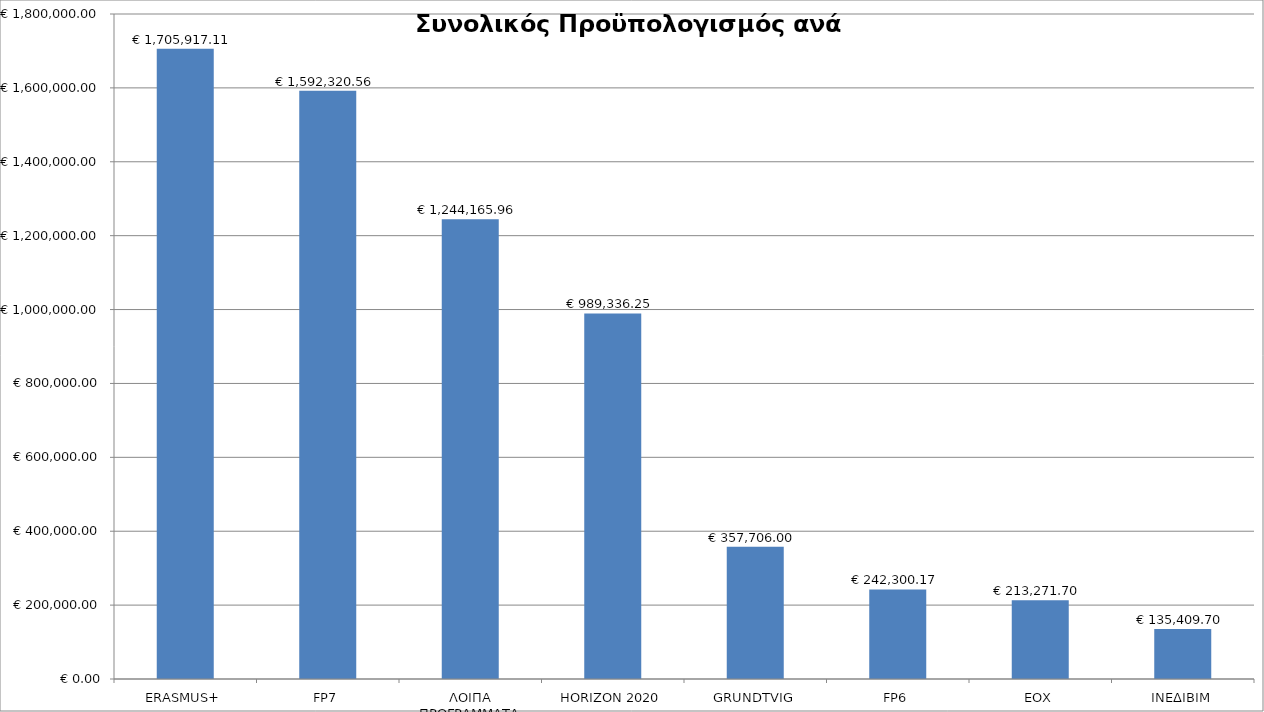
| Category | Series 0 |
|---|---|
| ERASMUS+ | 1705917.11 |
| FP7 | 1592320.56 |
| ΛΟΙΠΑ ΠΡΟΓΡΑΜΜΑΤΑ | 1244165.96 |
| HORIZON 2020 | 989336.25 |
| GRUNDTVIG | 357706 |
| FP6 | 242300.17 |
| EOX | 213271.7 |
| ΙΝΕΔΙΒΙΜ | 135409.7 |